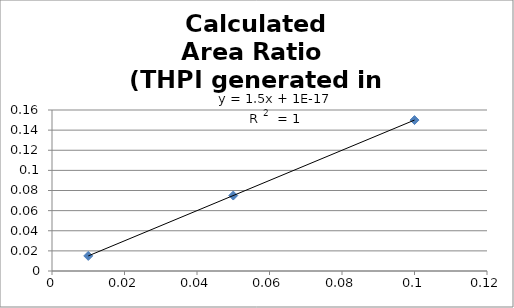
| Category | Calculated
Area Ratio 
(THPI generated in injector) |
|---|---|
| 0.01 | 0.015 |
| 0.05 | 0.075 |
| 0.1 | 0.15 |